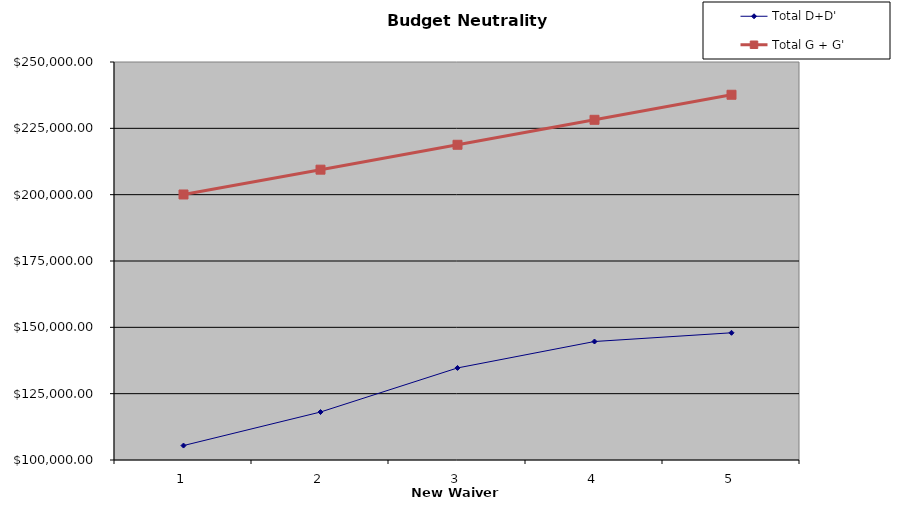
| Category | Total D+D' | Total G + G' |
|---|---|---|
| 0 | 105441.589 | 200070.334 |
| 1 | 118080.626 | 209423.6 |
| 2 | 134696.796 | 218805.147 |
| 3 | 144655.185 | 228215.741 |
| 4 | 147942.499 | 237656.164 |